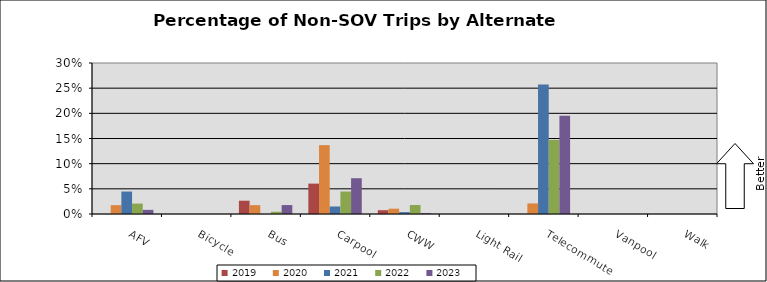
| Category | 2019 | 2020 | 2021 | 2022 | 2023 |
|---|---|---|---|---|---|
| AFV | 0 | 0.018 | 0.045 | 0.021 | 0.008 |
| Bicycle | 0 | 0 | 0 | 0 | 0 |
| Bus | 0.026 | 0.018 | 0 | 0.004 | 0.018 |
| Carpool | 0.06 | 0.137 | 0.015 | 0.045 | 0.071 |
| CWW | 0.008 | 0.011 | 0.004 | 0.018 | 0.002 |
| Light Rail | 0 | 0 | 0 | 0 | 0 |
| Telecommute | 0 | 0.021 | 0.257 | 0.147 | 0.195 |
| Vanpool | 0 | 0 | 0 | 0 | 0 |
| Walk | 0 | 0 | 0 | 0 | 0 |